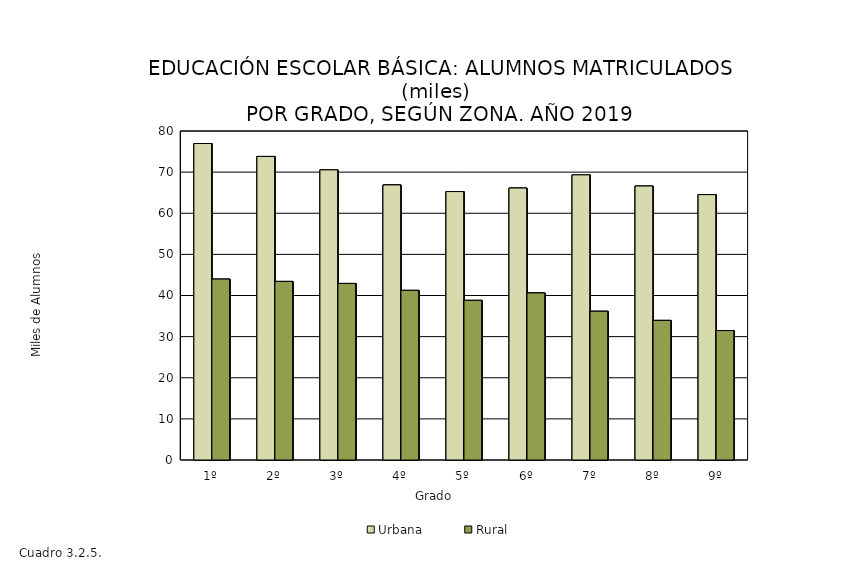
| Category | Urbana | Rural |
|---|---|---|
| 1º | 76.957 | 43.989 |
| 2º | 73.811 | 43.424 |
| 3º | 70.549 | 42.933 |
| 4º | 66.888 | 41.249 |
| 5º | 65.27 | 38.82 |
| 6º | 66.136 | 40.625 |
| 7º | 69.335 | 36.171 |
| 8º | 66.61 | 33.95 |
| 9º | 64.527 | 31.466 |